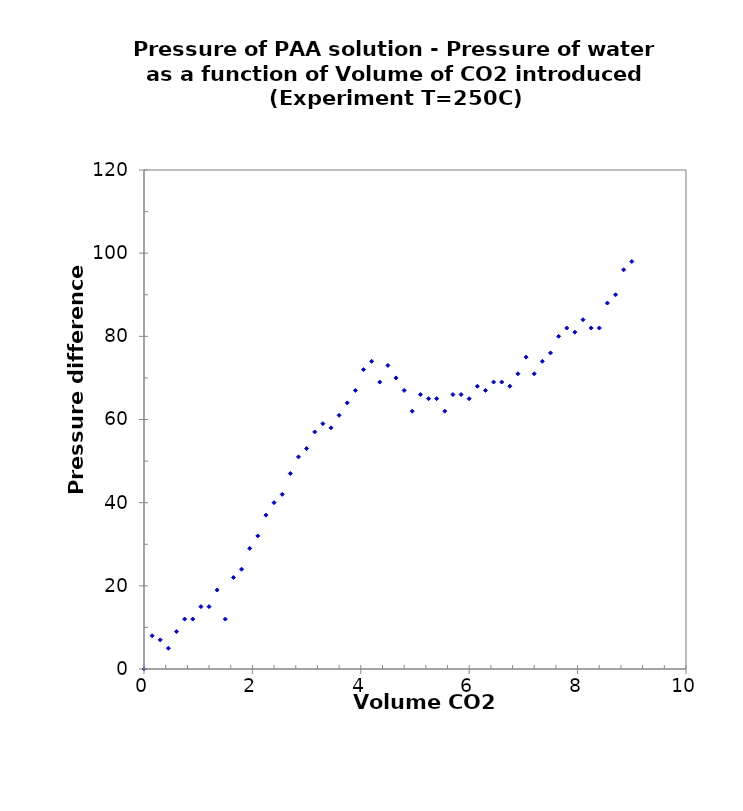
| Category | Series 0 |
|---|---|
| 0.0 | 0 |
| 0.15 | 8 |
| 0.3 | 7 |
| 0.45 | 5 |
| 0.6 | 9 |
| 0.75 | 12 |
| 0.9 | 12 |
| 1.05 | 15 |
| 1.2 | 15 |
| 1.35 | 19 |
| 1.5 | 12 |
| 1.65 | 22 |
| 1.8 | 24 |
| 1.95 | 29 |
| 2.1 | 32 |
| 2.25 | 37 |
| 2.4 | 40 |
| 2.55 | 42 |
| 2.7 | 47 |
| 2.85 | 51 |
| 3.0 | 53 |
| 3.15 | 57 |
| 3.3 | 59 |
| 3.45 | 58 |
| 3.6 | 61 |
| 3.75 | 64 |
| 3.9 | 67 |
| 4.05 | 72 |
| 4.2 | 74 |
| 4.35 | 69 |
| 4.5 | 73 |
| 4.649999999999999 | 70 |
| 4.8 | 67 |
| 4.95 | 62 |
| 5.1 | 66 |
| 5.25 | 65 |
| 5.399999999999999 | 65 |
| 5.55 | 62 |
| 5.7 | 66 |
| 5.85 | 66 |
| 6.0 | 65 |
| 6.149999999999999 | 68 |
| 6.3 | 67 |
| 6.45 | 69 |
| 6.6 | 69 |
| 6.75 | 68 |
| 6.899999999999999 | 71 |
| 7.05 | 75 |
| 7.199999999999999 | 71 |
| 7.35 | 74 |
| 7.5 | 76 |
| 7.649999999999999 | 80 |
| 7.8 | 82 |
| 7.95 | 81 |
| 8.1 | 84 |
| 8.25 | 82 |
| 8.4 | 82 |
| 8.549999999999997 | 88 |
| 8.7 | 90 |
| 8.85 | 96 |
| 9.0 | 98 |